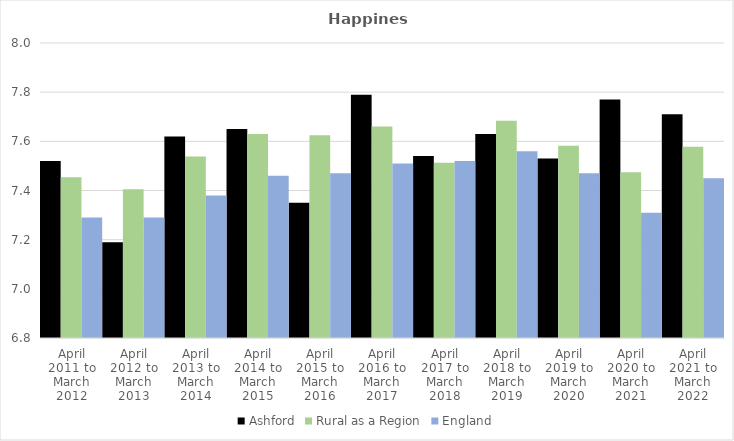
| Category | Ashford | Rural as a Region | England |
|---|---|---|---|
| April 2011 to March 2012 | 7.52 | 7.454 | 7.29 |
| April 2012 to March 2013 | 7.19 | 7.406 | 7.29 |
| April 2013 to March 2014 | 7.62 | 7.539 | 7.38 |
| April 2014 to March 2015 | 7.65 | 7.63 | 7.46 |
| April 2015 to March 2016 | 7.35 | 7.625 | 7.47 |
| April 2016 to March 2017 | 7.79 | 7.661 | 7.51 |
| April 2017 to March 2018 | 7.54 | 7.513 | 7.52 |
| April 2018 to March 2019 | 7.63 | 7.684 | 7.56 |
| April 2019 to March 2020 | 7.53 | 7.582 | 7.47 |
| April 2020 to March 2021 | 7.77 | 7.474 | 7.31 |
| April 2021 to March 2022 | 7.71 | 7.577 | 7.45 |